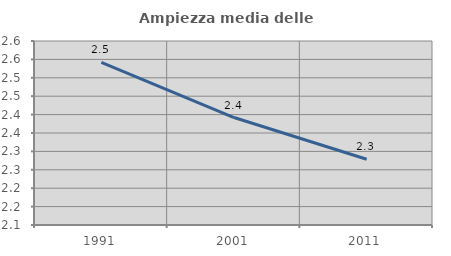
| Category | Ampiezza media delle famiglie |
|---|---|
| 1991.0 | 2.542 |
| 2001.0 | 2.392 |
| 2011.0 | 2.279 |